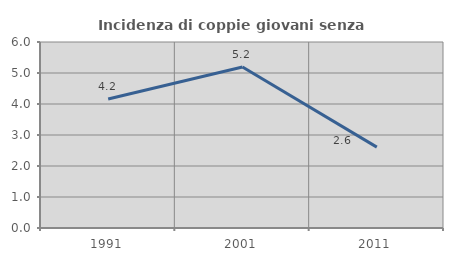
| Category | Incidenza di coppie giovani senza figli |
|---|---|
| 1991.0 | 4.162 |
| 2001.0 | 5.194 |
| 2011.0 | 2.609 |